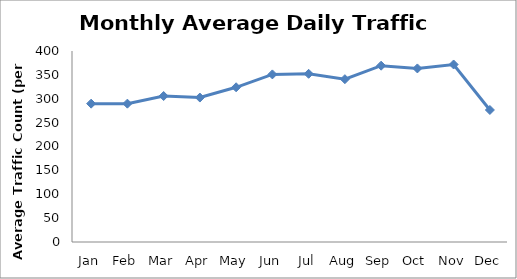
| Category | Series 0 |
|---|---|
| Jan | 289.75 |
| Feb | 289.75 |
| Mar | 305.75 |
| Apr | 302.5 |
| May | 324 |
| Jun | 351 |
| Jul | 352.25 |
| Aug | 341 |
| Sep | 369.25 |
| Oct | 363.5 |
| Nov | 371.75 |
| Dec | 276.5 |